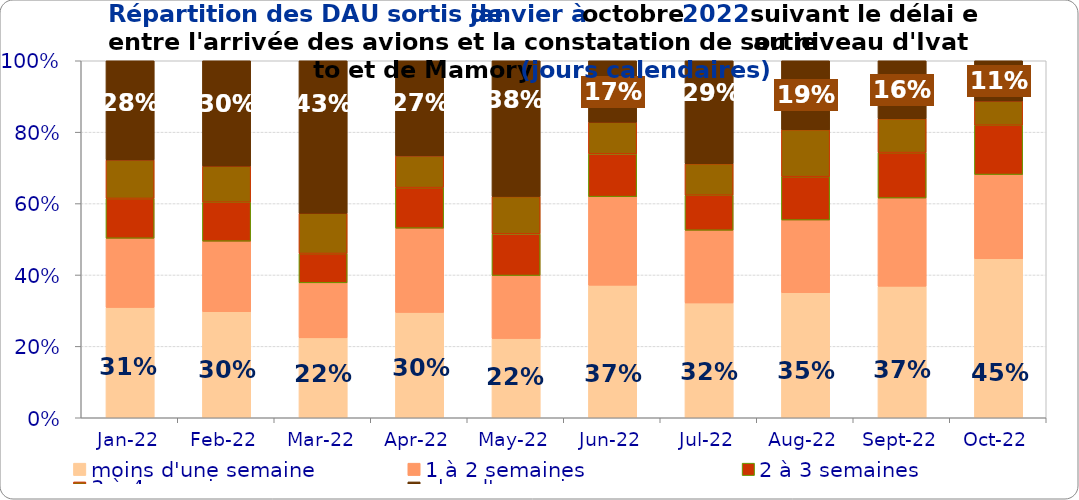
| Category | moins d'une semaine | 1 à 2 semaines | 2 à 3 semaines | 3 à 4 semaines | plus d'un mois |
|---|---|---|---|---|---|
| 2022-01-01 | 0.309 | 0.194 | 0.112 | 0.108 | 0.278 |
| 2022-02-01 | 0.297 | 0.197 | 0.109 | 0.101 | 0.295 |
| 2022-03-01 | 0.224 | 0.154 | 0.082 | 0.113 | 0.427 |
| 2022-04-01 | 0.295 | 0.236 | 0.114 | 0.089 | 0.266 |
| 2022-05-01 | 0.222 | 0.177 | 0.117 | 0.105 | 0.38 |
| 2022-06-01 | 0.371 | 0.248 | 0.12 | 0.089 | 0.172 |
| 2022-07-01 | 0.322 | 0.204 | 0.098 | 0.088 | 0.288 |
| 2022-08-01 | 0.35 | 0.204 | 0.122 | 0.132 | 0.193 |
| 2022-09-01 | 0.368 | 0.247 | 0.127 | 0.095 | 0.162 |
| 2022-10-01 | 0.445 | 0.236 | 0.138 | 0.068 | 0.113 |